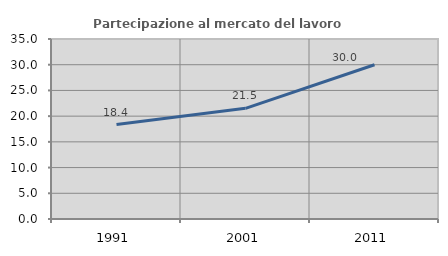
| Category | Partecipazione al mercato del lavoro  femminile |
|---|---|
| 1991.0 | 18.367 |
| 2001.0 | 21.519 |
| 2011.0 | 30 |